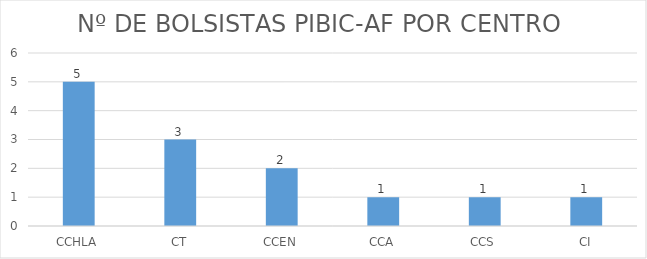
| Category | QTD |
|---|---|
| CCHLA | 5 |
| CT | 3 |
| CCEN | 2 |
| CCA | 1 |
| CCS | 1 |
| CI | 1 |